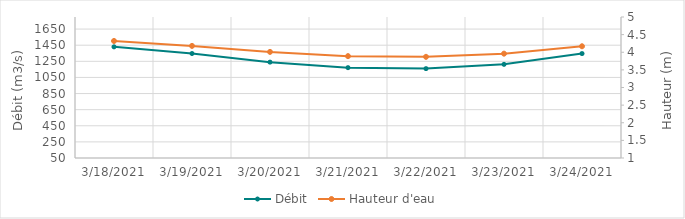
| Category | Débit |
|---|---|
| 2/18/21 | 1100.91 |
| 2/17/21 | 1227.19 |
| 2/16/21 | 1394.09 |
| 2/15/21 | 1566.5 |
| 2/14/21 | 1692.13 |
| 2/13/21 | 1750.82 |
| 2/12/21 | 1769.11 |